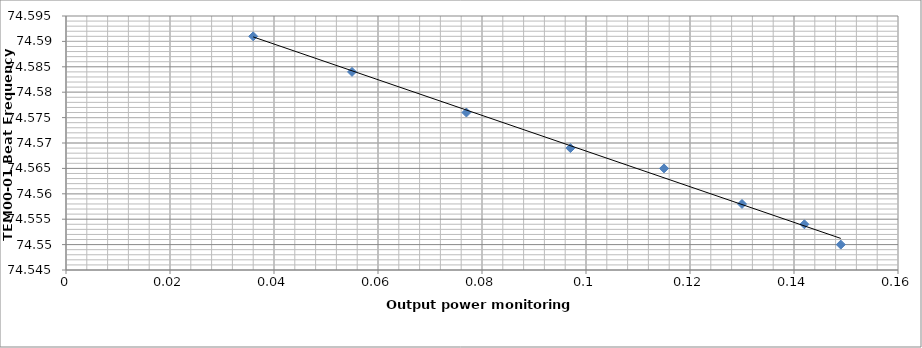
| Category | Series 0 |
|---|---|
| 0.149 | 74.55 |
| 0.142 | 74.554 |
| 0.13 | 74.558 |
| 0.115 | 74.565 |
| 0.097 | 74.569 |
| 0.077 | 74.576 |
| 0.055 | 74.584 |
| 0.036 | 74.591 |